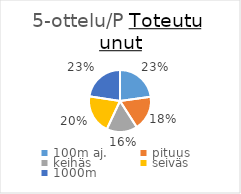
| Category | Series 0 |
|---|---|
| 100m aj. | 935 |
| pituus | 743 |
| keihäs | 658 |
| seiväs | 838 |
| 1000m | 926 |